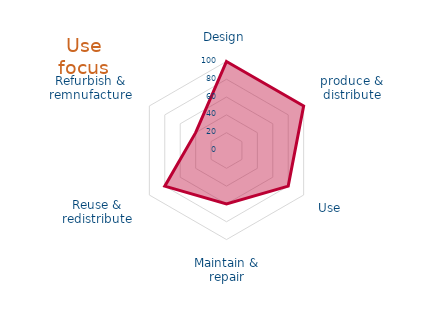
| Category | Fit your product/ service  |
|---|---|
| 0 | 100 |
| 1 | 100 |
| 2 | 80 |
| 3 | 60 |
| 4 | 80 |
| 5 | 40 |